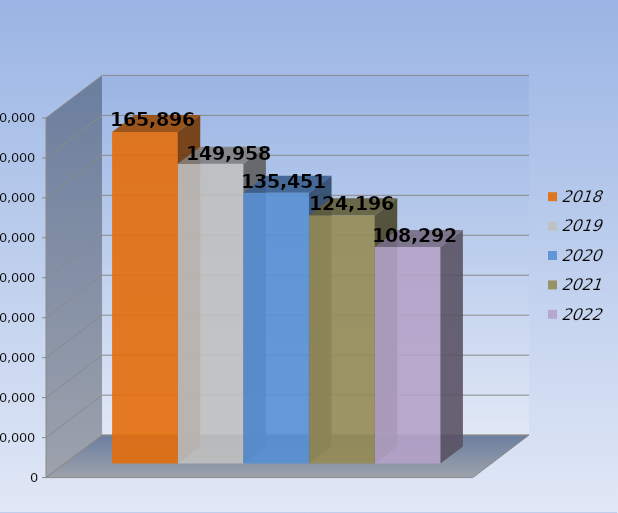
| Category | 2018 | 2019 | 2020 | 2021 | 2022 |
|---|---|---|---|---|---|
| 0 | 165896 | 149958 | 135451 | 124196 | 108292 |